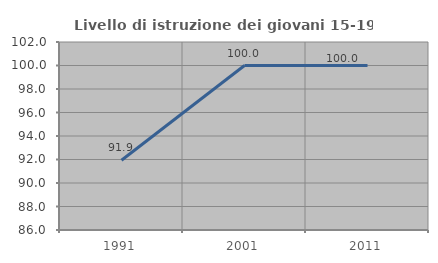
| Category | Livello di istruzione dei giovani 15-19 anni |
|---|---|
| 1991.0 | 91.935 |
| 2001.0 | 100 |
| 2011.0 | 100 |